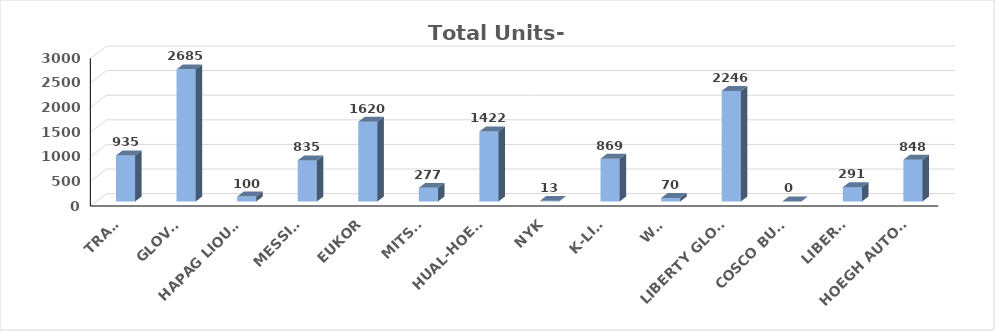
| Category | Series 0 |
|---|---|
| TRAMP | 935 |
| GLOVIS | 2685 |
| HAPAG LIOUYD | 100 |
| MESSINA | 835 |
| EUKOR | 1620 |
| MITSUI | 277 |
| HUAL-HOEGH | 1422 |
| NYK | 13 |
| K-LINE | 869 |
| WWL | 70 |
| LIBERTY GLOBA | 2246 |
| COSCO BULK | 0 |
| LIBERTY | 291 |
| HOEGH AUTOLIN | 848 |